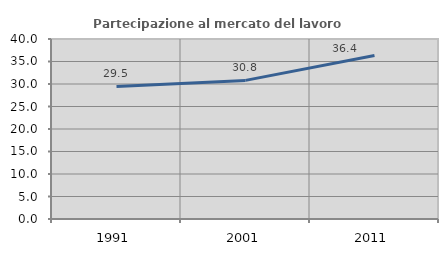
| Category | Partecipazione al mercato del lavoro  femminile |
|---|---|
| 1991.0 | 29.453 |
| 2001.0 | 30.804 |
| 2011.0 | 36.355 |